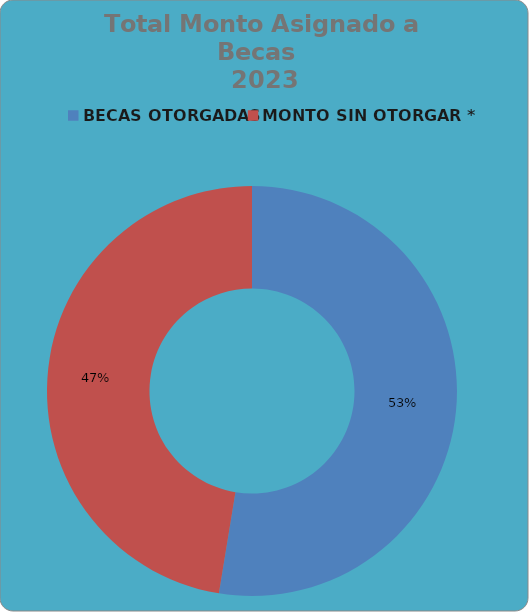
| Category | Series 0 |
|---|---|
| BECAS OTORGADAS | 731319.36 |
| MONTO SIN OTORGAR * | 659538.64 |